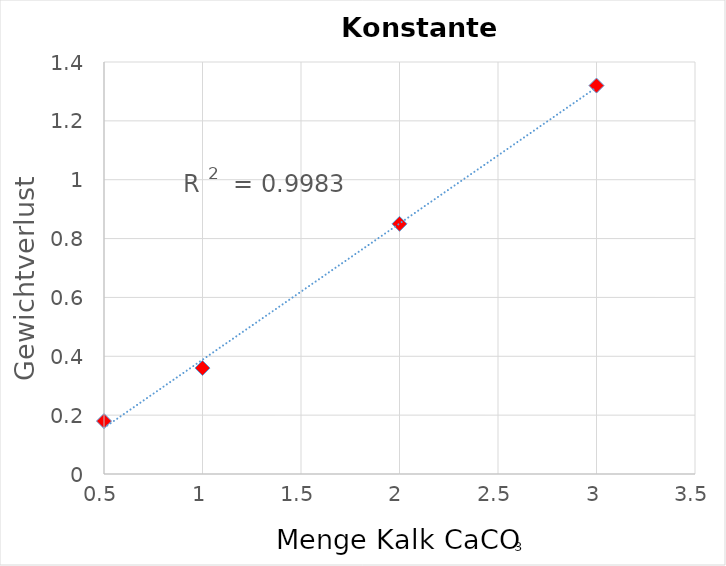
| Category | Gewichtsverlust in g |
|---|---|
| 0.5 | 0.18 |
| 1.0 | 0.36 |
| 2.0 | 0.85 |
| 3.0 | 1.32 |